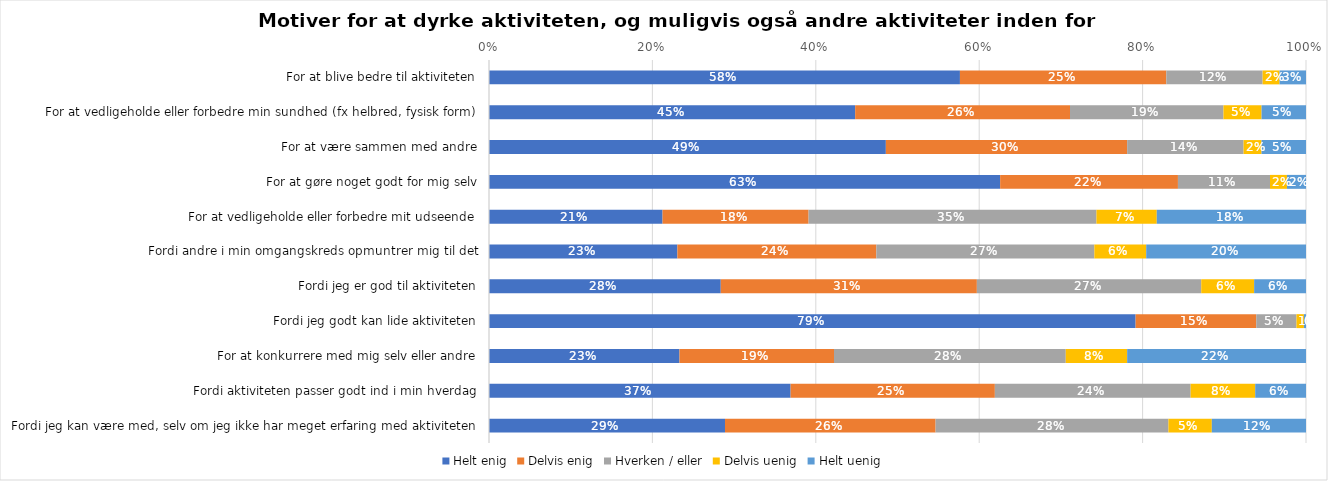
| Category | Helt enig | Delvis enig | Hverken / eller | Delvis uenig | Helt uenig |
|---|---|---|---|---|---|
| For at blive bedre til aktiviteten | 0.576 | 0.253 | 0.118 | 0.021 | 0.032 |
| For at vedligeholde eller forbedre min sundhed (fx helbred, fysisk form) | 0.448 | 0.263 | 0.188 | 0.047 | 0.054 |
| For at være sammen med andre | 0.486 | 0.295 | 0.142 | 0.022 | 0.054 |
| For at gøre noget godt for mig selv | 0.626 | 0.218 | 0.113 | 0.021 | 0.023 |
| For at vedligeholde eller forbedre mit udseende | 0.212 | 0.179 | 0.352 | 0.074 | 0.183 |
| Fordi andre i min omgangskreds opmuntrer mig til det | 0.231 | 0.244 | 0.267 | 0.063 | 0.196 |
| Fordi jeg er god til aktiviteten | 0.284 | 0.313 | 0.275 | 0.065 | 0.063 |
| Fordi jeg godt kan lide aktiviteten | 0.791 | 0.148 | 0.049 | 0.009 | 0.003 |
| For at konkurrere med mig selv eller andre | 0.233 | 0.189 | 0.284 | 0.075 | 0.219 |
| Fordi aktiviteten passer godt ind i min hverdag | 0.369 | 0.25 | 0.24 | 0.079 | 0.062 |
| Fordi jeg kan være med, selv om jeg ikke har meget erfaring med aktiviteten | 0.289 | 0.258 | 0.285 | 0.053 | 0.115 |